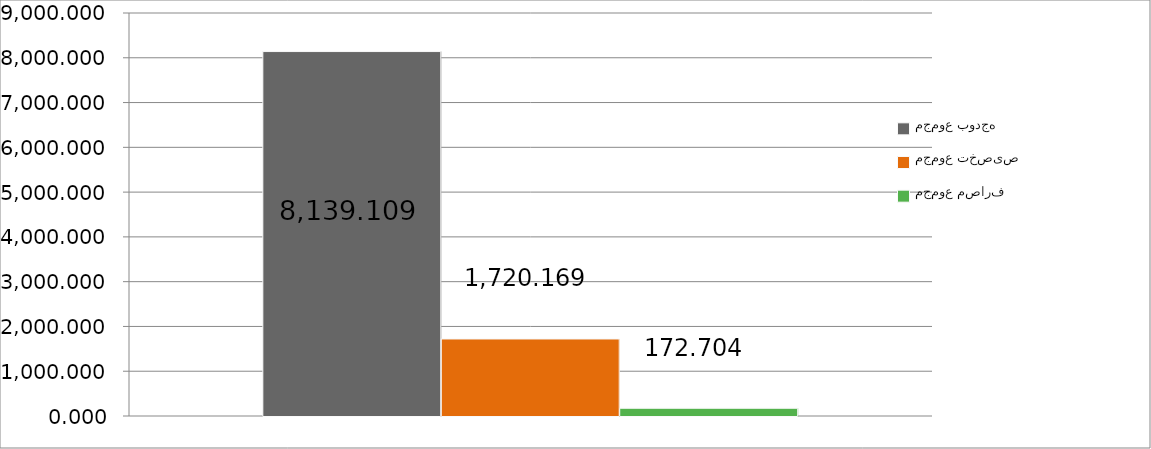
| Category | مجموع بودجه  | مجموع تخصیص | مجموع مصارف |
|---|---|---|---|
| 0 | 8139.109 | 1720.169 | 172.704 |